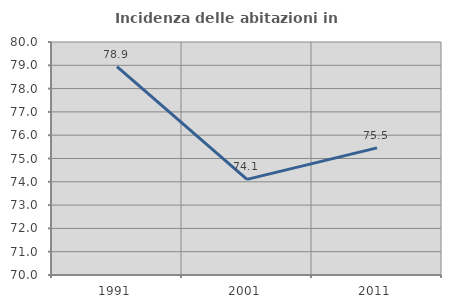
| Category | Incidenza delle abitazioni in proprietà  |
|---|---|
| 1991.0 | 78.947 |
| 2001.0 | 74.105 |
| 2011.0 | 75.456 |